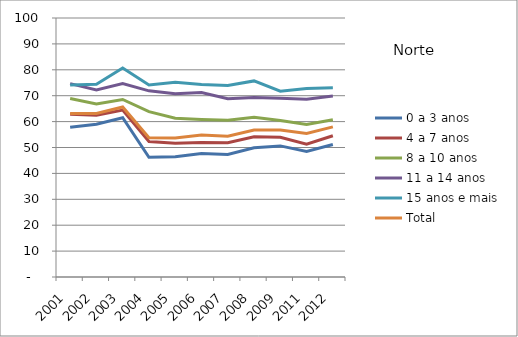
| Category | 0 a 3 anos | 4 a 7 anos | 8 a 10 anos | 11 a 14 anos | 15 anos e mais | Total |
|---|---|---|---|---|---|---|
| 2001.0 | 57.81 | 62.88 | 68.89 | 74.67 | 74.17 | 63.12 |
| 2002.0 | 59 | 62.47 | 66.81 | 72.26 | 74.38 | 63.17 |
| 2003.0 | 61.49 | 64.47 | 68.55 | 74.68 | 80.66 | 65.63 |
| 2004.0 | 46.22 | 52.3 | 63.83 | 71.88 | 74.13 | 53.77 |
| 2005.0 | 46.47 | 51.68 | 61.28 | 70.71 | 75.2 | 53.69 |
| 2006.0 | 47.67 | 51.97 | 60.83 | 71.2 | 74.34 | 54.78 |
| 2007.0 | 47.27 | 51.87 | 60.55 | 68.8 | 73.95 | 54.34 |
| 2008.0 | 49.92 | 54.18 | 61.68 | 69.27 | 75.71 | 56.73 |
| 2009.0 | 50.62 | 53.92 | 60.4 | 68.97 | 71.73 | 56.77 |
| 2011.0 | 48.46 | 51.3 | 58.9 | 68.59 | 72.74 | 55.4 |
| 2012.0 | 51.16 | 54.53 | 60.73 | 69.89 | 73.05 | 57.97 |